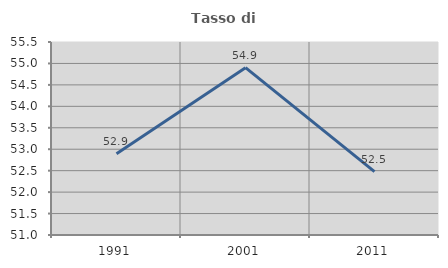
| Category | Tasso di occupazione   |
|---|---|
| 1991.0 | 52.894 |
| 2001.0 | 54.902 |
| 2011.0 | 52.477 |